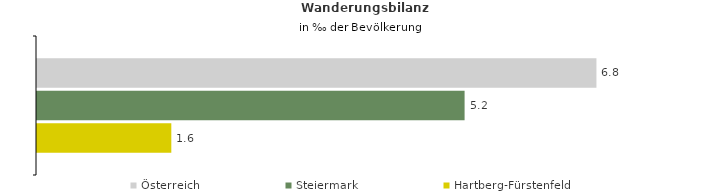
| Category | Österreich | Steiermark | Hartberg-Fürstenfeld |
|---|---|---|---|
| Wanderungsrate in ‰ der Bevölkerung, Periode 2015-2019 | 6.771 | 5.175 | 1.626 |